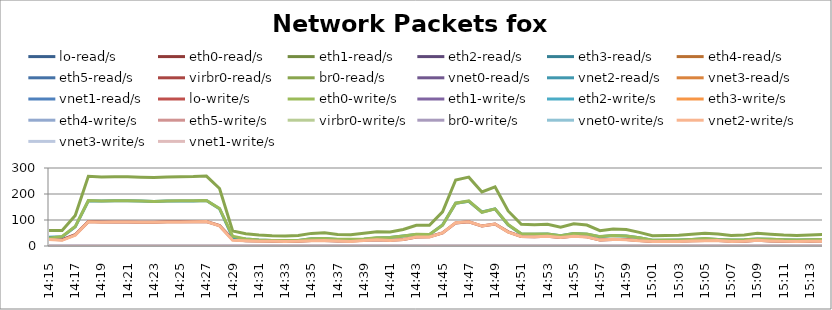
| Category | lo-read/s | eth0-read/s | eth1-read/s | eth2-read/s | eth3-read/s | eth4-read/s | eth5-read/s | virbr0-read/s | br0-read/s | vnet0-read/s | vnet2-read/s | vnet3-read/s | vnet1-read/s | lo-write/s | eth0-write/s | eth1-write/s | eth2-write/s | eth3-write/s | eth4-write/s | eth5-write/s | virbr0-write/s | br0-write/s | vnet0-write/s | vnet2-write/s | vnet3-write/s | vnet1-write/s |
|---|---|---|---|---|---|---|---|---|---|---|---|---|---|---|---|---|---|---|---|---|---|---|---|---|---|---|
| 14:15 | 0 | 25.9 | 0 | 0 | 0 | 0 | 0 | 0 | 59.5 | 0 | 33.5 | 0 | 0 | 0 | 29.7 | 0 | 0 | 0 | 0 | 0 | 0 | 0.8 | 0 | 25.2 | 0 | 0 |
| 14:16 | 0 | 24 | 0 | 0 | 0 | 0 | 0 | 0 | 59.4 | 0.2 | 35.1 | 0 | 0 | 0 | 37 | 0 | 0 | 0 | 0 | 0 | 0 | 2.2 | 0.5 | 21.9 | 0.2 | 0.2 |
| 14:17 | 0 | 43.5 | 0 | 0 | 0 | 0 | 0 | 0 | 117.7 | 0 | 73.8 | 0 | 0 | 0 | 74.8 | 0 | 0 | 0 | 0 | 0 | 0 | 1.8 | 0.2 | 41.7 | 0.2 | 0.2 |
| 14:18 | 0 | 93.9 | 0 | 0 | 0 | 0 | 0 | 0 | 268 | 0 | 174 | 0 | 0.1 | 0 | 174.6 | 0 | 0 | 0 | 0 | 0 | 0 | 0.5 | 0.3 | 93.3 | 0.3 | 0.2 |
| 14:19 | 0 | 91.9 | 0 | 0 | 0 | 0 | 0 | 0 | 265 | 0 | 173.1 | 0 | 0 | 0 | 173.3 | 0 | 0 | 0 | 0 | 0 | 0 | 0.1 | 0.2 | 91.7 | 0.2 | 0.2 |
| 14:20 | 0 | 92.5 | 0 | 0 | 0 | 0 | 0 | 0 | 266.3 | 0 | 173.7 | 0 | 0 | 0 | 173.9 | 0 | 0 | 0 | 0 | 0 | 0 | 0.2 | 0.2 | 92.4 | 0.2 | 0.2 |
| 14:21 | 0 | 92.7 | 0 | 0 | 0 | 0 | 0 | 0 | 266.7 | 0 | 174 | 0 | 0 | 0 | 174.4 | 0 | 0 | 0 | 0 | 0 | 0 | 0.3 | 0.2 | 92.3 | 0.2 | 0.2 |
| 14:22 | 0 | 91.5 | 0 | 0 | 0 | 0 | 0 | 0 | 264.6 | 0 | 172.6 | 0 | 0.4 | 0 | 172.9 | 0 | 0 | 0 | 0 | 0 | 0 | 0.3 | 0.3 | 91.6 | 0.3 | 0.4 |
| 14:23 | 0 | 91.7 | 0 | 0 | 0 | 0 | 0 | 0 | 263 | 0 | 171.2 | 0 | 0 | 0 | 171.5 | 0 | 0 | 0 | 0 | 0 | 0 | 0.4 | 0.2 | 91.3 | 0.2 | 0.2 |
| 14:24 | 0 | 93 | 0 | 0 | 0 | 0 | 0 | 0 | 265.5 | 0 | 172.7 | 0 | 0 | 0 | 172.9 | 0 | 0 | 0 | 0 | 0 | 0 | 0.2 | 0.2 | 92.6 | 0.2 | 0.2 |
| 14:25 | 0 | 92.9 | 0 | 0 | 0 | 0 | 0 | 0 | 266.4 | 0 | 173.2 | 0 | 0.1 | 0 | 173.7 | 0 | 0 | 0 | 0 | 0 | 0 | 0.4 | 0.2 | 92.6 | 0.2 | 0.2 |
| 14:26 | 0 | 93.2 | 0 | 0 | 0 | 0 | 0 | 0 | 266.9 | 0 | 173.5 | 0 | 0 | 0 | 173.7 | 0 | 0 | 0 | 0 | 0 | 0 | 0.2 | 0.2 | 93.1 | 0.2 | 0.2 |
| 14:27 | 0 | 94.1 | 0 | 0 | 0 | 0 | 0 | 0 | 269 | 0 | 174.9 | 0 | 0 | 0 | 175.1 | 0 | 0 | 0 | 0 | 0 | 0 | 0.1 | 0.2 | 93.9 | 0.2 | 0.2 |
| 14:28 | 0 | 78.2 | 0 | 0 | 0 | 0 | 0 | 0 | 221.2 | 0 | 143.3 | 0 | 0.1 | 0 | 144.5 | 0 | 0 | 0 | 0 | 0 | 0 | 0.2 | 0.2 | 77.5 | 0.2 | 0.3 |
| 14:29 | 0 | 24.7 | 0 | 0 | 0 | 0 | 0 | 0 | 57.5 | 0 | 32.8 | 0 | 0 | 0 | 37.9 | 0 | 0 | 0 | 0 | 0 | 0 | 2.2 | 0.2 | 21.9 | 0.2 | 0.2 |
| 14:30 | 0.1 | 20.5 | 0 | 0 | 0 | 0 | 0 | 0 | 47 | 0 | 26.6 | 0 | 0 | 0.1 | 27 | 0 | 0 | 0 | 0 | 0 | 0 | 0.2 | 0.2 | 20.1 | 0.2 | 0.2 |
| 14:31 | 0 | 19.3 | 0 | 0 | 0 | 0 | 0 | 0 | 42.3 | 0 | 23 | 0 | 0 | 0 | 23.5 | 0 | 0 | 0 | 0 | 0 | 0 | 0.4 | 0.2 | 18.7 | 0.2 | 0.2 |
| 14:32 | 0 | 18.2 | 0 | 0 | 0 | 0 | 0 | 0 | 39.4 | 0 | 21.1 | 0 | 0 | 0 | 21.4 | 0 | 0 | 0 | 0 | 0 | 0 | 0.2 | 0.2 | 18 | 0.2 | 0.2 |
| 14:33 | 0 | 17.6 | 0 | 0 | 0 | 0 | 0 | 0 | 38.2 | 0 | 20.6 | 0 | 0.1 | 0 | 20.9 | 0 | 0 | 0 | 0 | 0 | 0 | 0.1 | 0.2 | 17.4 | 0.2 | 0.2 |
| 14:34 | 0 | 17.9 | 0 | 0 | 0 | 0 | 0 | 0 | 40 | 0 | 21.5 | 0 | 0.5 | 0 | 21.6 | 0 | 0 | 0 | 0 | 0 | 0 | 0.2 | 0.4 | 18.2 | 0.4 | 0.4 |
| 14:35 | 0 | 21.1 | 0 | 0 | 0 | 0 | 0 | 0 | 48.5 | 0 | 27.5 | 0 | 0 | 0 | 27.9 | 0 | 0 | 0 | 0 | 0 | 0 | 0.3 | 0.2 | 20.5 | 0.2 | 0.2 |
| 14:36 | 0 | 21.3 | 0 | 0 | 0 | 0 | 0 | 0 | 50.6 | 0 | 29.1 | 0 | 0 | 0 | 29 | 0 | 0 | 0 | 0 | 0 | 0 | 0.2 | 0.2 | 21.2 | 0.2 | 0.2 |
| 14:37 | 0 | 19.5 | 0 | 0 | 0 | 0 | 0 | 0 | 44.5 | 0 | 25.1 | 0 | 0 | 0 | 25.7 | 0 | 0 | 0 | 0 | 0 | 0 | 0.2 | 0.2 | 19.1 | 0.2 | 0.2 |
| 14:38 | 0 | 19.7 | 0 | 0 | 0 | 0 | 0 | 0 | 43.1 | 0 | 23.3 | 0 | 0 | 0 | 25.9 | 0 | 0 | 0 | 0 | 0 | 0 | 2.2 | 0.2 | 17.3 | 0.2 | 0.2 |
| 14:39 | 0 | 22.5 | 0 | 0 | 0 | 0 | 0 | 0 | 48.7 | 0 | 26.3 | 0 | 0 | 0 | 27.4 | 0 | 0 | 0 | 0 | 0 | 0 | 1.1 | 0.2 | 21 | 0.2 | 0.2 |
| 14:40 | 0 | 23.9 | 0 | 0 | 0 | 0 | 0 | 0 | 55.1 | 0 | 31.1 | 0 | 0.1 | 0 | 31.5 | 0 | 0 | 0 | 0 | 0 | 0 | 0.2 | 0.3 | 23.7 | 0.3 | 0.2 |
| 14:41 | 0 | 21.7 | 0 | 0 | 0 | 0 | 0 | 0 | 54.1 | 0 | 32.3 | 0 | 0 | 0 | 32.5 | 0 | 0 | 0 | 0 | 0 | 0 | 0.3 | 0.2 | 21.4 | 0.2 | 0.2 |
| 14:42 | 0 | 24.9 | 0 | 0 | 0 | 0 | 0 | 0 | 63.7 | 0 | 38.5 | 0 | 0 | 0 | 38.4 | 0 | 0 | 0 | 0 | 0 | 0 | 0.2 | 0.2 | 25 | 0.2 | 0.2 |
| 14:43 | 0 | 34.9 | 0 | 0 | 0 | 0 | 0 | 0 | 79.5 | 0 | 44.7 | 0 | 0 | 0 | 45.2 | 0 | 0 | 0 | 0 | 0 | 0 | 0.2 | 0.2 | 34.6 | 0.2 | 0.2 |
| 14:44 | 0 | 35.4 | 0 | 0 | 0 | 0 | 0 | 0 | 79.6 | 0 | 43.8 | 0 | 0.3 | 0 | 44.2 | 0 | 0 | 0 | 0 | 0 | 0 | 0.2 | 0.2 | 34.9 | 0.2 | 0.5 |
| 14:45 | 0 | 50 | 0 | 0 | 0 | 0 | 0 | 0 | 131.2 | 0 | 80.6 | 0 | 0.1 | 0 | 80.1 | 0 | 0 | 0 | 0 | 0 | 0 | 0.3 | 0.2 | 50 | 0.2 | 0.2 |
| 14:46 | 0 | 88.9 | 0 | 0 | 0 | 0 | 0 | 0 | 253.9 | 0 | 164.6 | 0 | 0.4 | 0 | 164.8 | 0 | 0 | 0 | 0 | 0 | 0 | 0.2 | 0.3 | 89.1 | 0.3 | 0.4 |
| 14:47 | 0 | 93.4 | 0 | 0 | 0 | 0 | 0 | 0 | 264.8 | 0 | 171.8 | 0 | 0.1 | 0 | 173.3 | 0 | 0 | 0 | 0 | 0 | 0 | 0.2 | 0.3 | 92.8 | 0.3 | 0.2 |
| 14:48 | 0 | 76.7 | 0 | 0 | 0 | 0 | 0 | 0 | 208 | 0 | 130.7 | 0 | 0 | 0 | 129.9 | 0 | 0 | 0 | 0 | 0 | 0 | 0.2 | 0.2 | 77 | 0.2 | 0.2 |
| 14:49 | 0 | 84.4 | 0 | 0 | 0 | 0 | 0 | 0 | 227.8 | 0 | 143 | 0 | 0 | 0 | 143 | 0 | 0 | 0 | 0 | 0 | 0 | 0.2 | 0.2 | 84.5 | 0.2 | 0.2 |
| 14:50 | 0 | 54.4 | 0 | 0 | 0 | 0 | 0 | 0 | 134.8 | 0 | 81.2 | 0 | 0 | 0 | 82.6 | 0 | 0 | 0 | 0 | 0 | 0 | 0.3 | 0.2 | 53.3 | 0.2 | 0.2 |
| 14:51 | 0 | 37 | 0 | 0 | 0 | 0 | 0 | 0 | 83.6 | 0 | 46.5 | 0 | 0 | 0 | 46.9 | 0 | 0 | 0 | 0 | 0 | 0 | 0.4 | 0.2 | 36.6 | 0.2 | 0.2 |
| 14:52 | 0 | 36 | 0 | 0 | 0 | 0 | 0 | 0 | 81.5 | 0 | 45.6 | 0 | 0 | 0 | 45.9 | 0 | 0 | 0 | 0 | 0 | 0 | 0.2 | 0.2 | 35.6 | 0.2 | 0.2 |
| 14:53 | 0 | 37.4 | 0 | 0 | 0 | 0 | 0 | 0 | 83.6 | 0 | 46.2 | 0 | 0 | 0 | 46.4 | 0 | 0 | 0 | 0 | 0 | 0 | 0.2 | 0.2 | 37.2 | 0.2 | 0.2 |
| 14:54 | 0 | 32.8 | 0 | 0 | 0 | 0 | 0 | 0 | 72.2 | 0 | 39.2 | 0 | 0.1 | 0 | 39.4 | 0 | 0 | 0 | 0 | 0 | 0 | 0.2 | 0.3 | 32.8 | 0.3 | 0.2 |
| 14:55 | 0 | 38.2 | 0 | 0 | 0 | 0 | 0 | 0 | 85.8 | 0 | 47.6 | 0 | 0.1 | 0 | 47.8 | 0 | 0 | 0 | 0 | 0 | 0 | 0.2 | 0.2 | 37.9 | 0.2 | 0.2 |
| 14:56 | 0 | 35.1 | 0 | 0 | 0 | 0 | 0 | 0 | 80.5 | 0 | 45.4 | 0 | 0 | 0 | 45.7 | 0 | 0 | 0 | 0 | 0 | 0 | 0.3 | 0.2 | 34.8 | 0.2 | 0.2 |
| 14:57 | 0 | 23.5 | 0 | 0 | 0 | 0 | 0 | 0 | 59.1 | 0 | 35.7 | 0 | 0 | 0 | 36.1 | 0 | 0 | 0 | 0 | 0 | 0 | 0.2 | 0.2 | 23.2 | 0.2 | 0.2 |
| 14:58 | 0 | 25.3 | 0 | 0 | 0 | 0 | 0 | 0 | 65.8 | 0 | 39.9 | 0 | 0.4 | 0 | 40 | 0 | 0 | 0 | 0 | 0 | 0 | 0.2 | 0.3 | 25.5 | 0.3 | 0.4 |
| 14:59 | 0 | 25.1 | 0 | 0 | 0 | 0 | 0 | 0 | 63.2 | 0 | 38.2 | 0 | 0 | 0 | 38.8 | 0 | 0 | 0 | 0 | 0 | 0 | 0.4 | 0.2 | 24.5 | 0.2 | 0.2 |
| 15:00 | 0 | 21 | 0 | 0 | 0 | 0 | 0 | 0 | 52.4 | 0 | 31.5 | 0 | 0 | 0 | 32 | 0 | 0 | 0 | 0 | 0 | 0 | 0.3 | 0.2 | 20.5 | 0.2 | 0.2 |
| 15:01 | 0 | 17.2 | 0 | 0 | 0 | 0 | 0 | 0 | 39.4 | 0 | 22 | 0 | 0.1 | 0 | 22.4 | 0 | 0 | 0 | 0 | 0 | 0 | 0.3 | 0.3 | 17 | 0.3 | 0.2 |
| 15:02 | 0 | 17.8 | 0 | 0 | 0 | 0 | 0 | 0 | 40 | 0 | 22.3 | 0 | 0.1 | 0 | 22.6 | 0 | 0 | 0 | 0 | 0 | 0 | 0.3 | 0.2 | 17.4 | 0.2 | 0.2 |
| 15:03 | 0 | 17.8 | 0 | 0 | 0 | 0 | 0 | 0 | 41.2 | 0 | 23.2 | 0 | 0 | 0 | 23.1 | 0 | 0 | 0 | 0 | 0 | 0 | 0.2 | 0.2 | 17.7 | 0.2 | 0.2 |
| 15:04 | 0 | 19.9 | 0 | 0 | 0 | 0 | 0 | 0 | 44.9 | 0 | 25.1 | 0 | 0 | 0 | 25.4 | 0 | 0 | 0 | 0 | 0 | 0 | 0.2 | 0.2 | 19.6 | 0.2 | 0.2 |
| 15:05 | 0 | 21.3 | 0 | 0 | 0 | 0 | 0 | 0 | 48.7 | 0 | 27.5 | 0 | 0 | 0 | 28.7 | 0 | 0 | 0 | 0 | 0 | 0 | 0.6 | 0.2 | 20.2 | 0.2 | 0.2 |
| 15:06 | 0 | 20.9 | 0 | 0 | 0 | 0 | 0 | 0 | 46 | 0 | 25 | 0 | 0 | 0 | 25.1 | 0 | 0 | 0 | 0 | 0 | 0 | 0.2 | 0.2 | 20.8 | 0.2 | 0.2 |
| 15:07 | 0 | 17.8 | 0 | 0 | 0 | 0 | 0 | 0 | 40.8 | 0 | 23 | 0 | 0 | 0 | 23.2 | 0 | 0 | 0 | 0 | 0 | 0 | 0.2 | 0.2 | 17.6 | 0.2 | 0.2 |
| 15:08 | 0 | 18.4 | 0 | 0 | 0 | 0 | 0 | 0 | 42.1 | 0 | 23.7 | 0 | 0.1 | 0 | 24.3 | 0 | 0 | 0 | 0 | 0 | 0 | 0.3 | 0.3 | 17.9 | 0.3 | 0.2 |
| 15:09 | 0 | 21.9 | 0 | 0 | 0 | 0 | 0 | 0 | 48.7 | 0 | 26.8 | 0 | 0 | 0 | 27 | 0 | 0 | 0 | 0 | 0 | 0 | 0.2 | 0.2 | 21.8 | 0.2 | 0.2 |
| 15:10 | 0 | 19.4 | 0 | 0 | 0 | 0 | 0 | 0 | 45.4 | 0 | 25.6 | 0 | 0.4 | 0 | 25.7 | 0 | 0 | 0 | 0 | 0 | 0 | 0.2 | 0.3 | 19.6 | 0.3 | 0.4 |
| 15:11 | 0 | 17.9 | 0 | 0 | 0 | 0 | 0 | 0 | 41.9 | 0 | 23.9 | 0 | 0 | 0 | 24 | 0 | 0 | 0 | 0 | 0 | 0 | 0.2 | 0.2 | 17.8 | 0.2 | 0.2 |
| 15:12 | 0 | 17.9 | 0 | 0 | 0 | 0 | 0 | 0 | 40.7 | 0 | 22.8 | 0 | 0 | 0 | 23 | 0 | 0 | 0 | 0 | 0 | 0 | 0.2 | 0.2 | 17.6 | 0.2 | 0.2 |
| 15:13 | 0 | 18.1 | 0 | 0 | 0 | 0 | 0 | 0 | 42.3 | 0 | 24 | 0 | 0 | 0 | 24.3 | 0 | 0 | 0 | 0 | 0 | 0 | 0.3 | 0.2 | 17.9 | 0.2 | 0.2 |
| 15:14 | 0 | 18.9 | 0 | 0 | 0 | 0 | 0 | 0 | 43.9 | 0 | 25.1 | 0 | 0 | 0 | 25.4 | 0 | 0 | 0 | 0 | 0 | 0 | 0.2 | 0.2 | 18.5 | 0.2 | 0.2 |